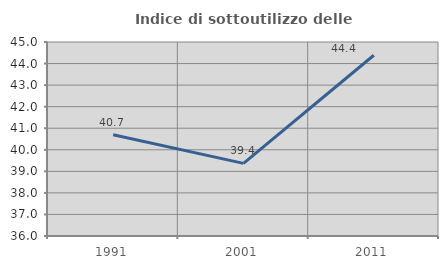
| Category | Indice di sottoutilizzo delle abitazioni  |
|---|---|
| 1991.0 | 40.698 |
| 2001.0 | 39.37 |
| 2011.0 | 44.386 |